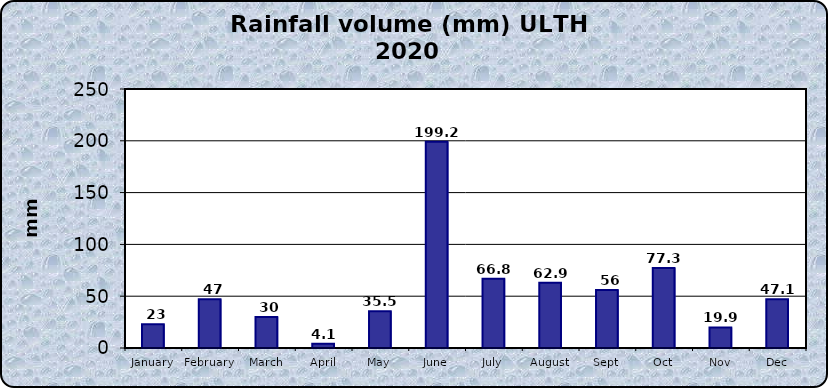
| Category | Series 0 |
|---|---|
| January | 23 |
| February | 47 |
| March | 30 |
| April | 4.1 |
| May | 35.5 |
| June | 199.2 |
| July | 66.8 |
| August | 62.9 |
| Sept | 56 |
| Oct | 77.3 |
| Nov | 19.9 |
| Dec | 47.1 |